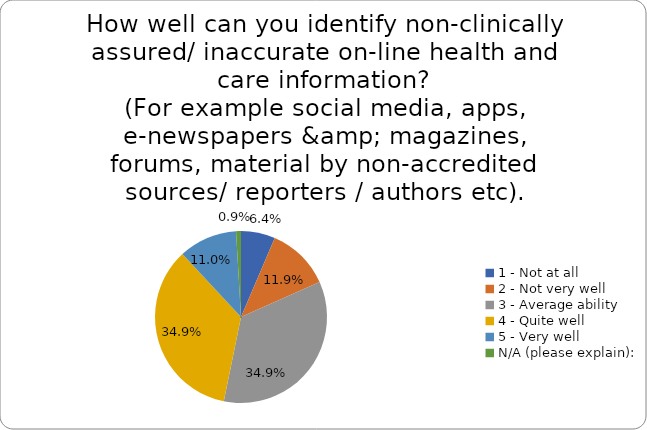
| Category | Series 0 |
|---|---|
| 1 - Not at all | 0.064 |
| 2 - Not very well | 0.119 |
| 3 - Average ability | 0.349 |
| 4 - Quite well | 0.349 |
| 5 - Very well | 0.11 |
| N/A (please explain): | 0.009 |